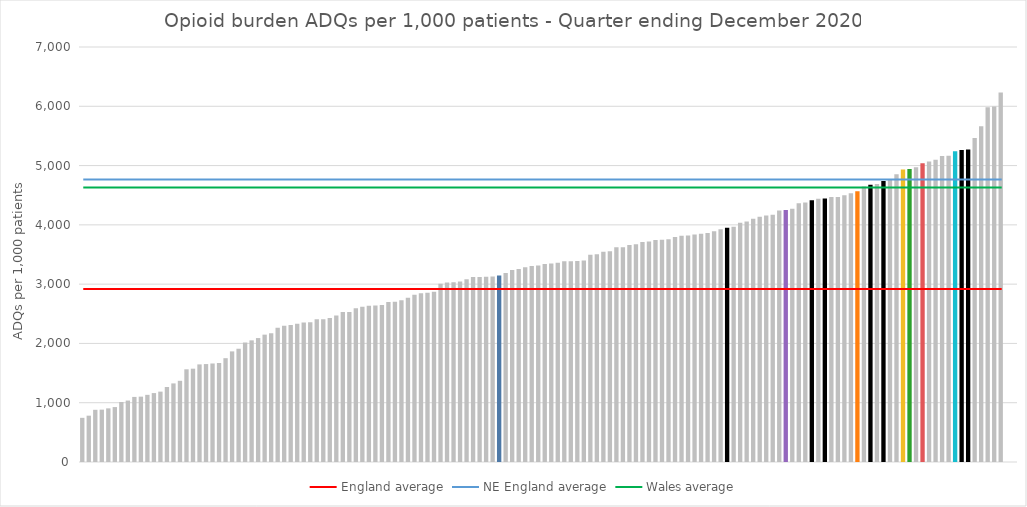
| Category | Series 0 |
|---|---|
| English CCGs | 744.985 |
| English CCGs | 781.48 |
| English CCGs | 880.454 |
| English CCGs | 883.087 |
| English CCGs | 904.651 |
| English CCGs | 926.491 |
| English CCGs | 1012.547 |
| English CCGs | 1036.6 |
| English CCGs | 1097.595 |
| English CCGs | 1102.342 |
| English CCGs | 1132.677 |
| English CCGs | 1162.539 |
| English CCGs | 1186.973 |
| English CCGs | 1265.041 |
| English CCGs | 1325.618 |
| English CCGs | 1369.767 |
| English CCGs | 1563.737 |
| English CCGs | 1573.845 |
| English CCGs | 1646.291 |
| English CCGs | 1651.931 |
| English CCGs | 1661.753 |
| English CCGs | 1670.062 |
| English CCGs | 1751.035 |
| English CCGs | 1865.799 |
| English CCGs | 1910.528 |
| English CCGs | 2015.16 |
| English CCGs | 2052.041 |
| English CCGs | 2090.422 |
| English CCGs | 2148.154 |
| English CCGs | 2173.169 |
| English CCGs | 2263.6 |
| English CCGs | 2299.054 |
| English CCGs | 2310.799 |
| English CCGs | 2333.596 |
| English CCGs | 2351.736 |
| English CCGs | 2358.438 |
| English CCGs | 2405.926 |
| English CCGs | 2409.305 |
| English CCGs | 2430.844 |
| English CCGs | 2470.571 |
| English CCGs | 2528.955 |
| English CCGs | 2530.129 |
| English CCGs | 2593.821 |
| English CCGs | 2618.845 |
| English CCGs | 2636.886 |
| English CCGs | 2641.232 |
| English CCGs | 2647.521 |
| English CCGs | 2698.96 |
| English CCGs | 2703.673 |
| English CCGs | 2728.677 |
| English CCGs | 2768.501 |
| English CCGs | 2821.471 |
| English CCGs | 2845.285 |
| English CCGs | 2853.316 |
| English CCGs | 2870.971 |
| English CCGs | 3005.536 |
| English CCGs | 3026.586 |
| English CCGs | 3032.803 |
| English CCGs | 3045.423 |
| English CCGs | 3083.761 |
| English CCGs | 3118.633 |
| English CCGs | 3121.614 |
| English CCGs | 3124.808 |
| English CCGs | 3128.296 |
| Cardiff and Vale | 3144.792 |
| English CCGs | 3190.046 |
| English CCGs | 3238.246 |
| English CCGs | 3256.469 |
| English CCGs | 3283.774 |
| English CCGs | 3305.314 |
| English CCGs | 3312.45 |
| English CCGs | 3339.839 |
| English CCGs | 3346.485 |
| English CCGs | 3359.534 |
| English CCGs | 3384.191 |
| English CCGs | 3384.459 |
| English CCGs | 3390.073 |
| English CCGs | 3398.361 |
| English CCGs | 3493.787 |
| English CCGs | 3503.411 |
| English CCGs | 3547.334 |
| English CCGs | 3555.519 |
| English CCGs | 3623.953 |
| English CCGs | 3624.33 |
| English CCGs | 3659.939 |
| English CCGs | 3673.595 |
| English CCGs | 3712.524 |
| English CCGs | 3719.655 |
| English CCGs | 3744.336 |
| English CCGs | 3749.73 |
| English CCGs | 3755.179 |
| English CCGs | 3797.275 |
| English CCGs | 3816.616 |
| English CCGs | 3821 |
| English CCGs | 3837.839 |
| English CCGs | 3848.899 |
| English CCGs | 3862.826 |
| English CCGs | 3890.969 |
| English CCGs | 3925.83 |
| NE England | 3949.556 |
| English CCGs | 3966.134 |
| English CCGs | 4034.15 |
| English CCGs | 4054.922 |
| English CCGs | 4102.306 |
| English CCGs | 4134.704 |
| English CCGs | 4156.473 |
| English CCGs | 4169.21 |
| English CCGs | 4242.246 |
| Powys  | 4251.498 |
| English CCGs | 4272.828 |
| English CCGs | 4364.964 |
| English CCGs | 4376.67 |
| NE England | 4416.781 |
| English CCGs | 4439.936 |
| NE England | 4443.615 |
| English CCGs | 4468.812 |
| English CCGs | 4471.625 |
| English CCGs | 4501.46 |
| English CCGs | 4533.971 |
| Swansea Bay UHB | 4567.663 |
| English CCGs | 4648.252 |
| NE England | 4675.18 |
| English CCGs | 4687.334 |
| NE England | 4737.765 |
| English CCGs | 4773.54 |
| English CCGs | 4854.035 |
| Aneurin Bevan | 4934.693 |
| BCU | 4943.766 |
| English CCGs | 4969.614 |
| Hywel Dda | 5037.872 |
| English CCGs | 5069.674 |
| English CCGs | 5098.628 |
| English CCGs | 5162.342 |
| English CCGs | 5164.238 |
| Cwm Taf Morgannwg UHB | 5240.628 |
| NE England | 5262.986 |
| NE England | 5272.002 |
| English CCGs | 5466.482 |
| English CCGs | 5664.371 |
| English CCGs | 5984.12 |
| English CCGs | 5997.756 |
| English CCGs | 6234.067 |